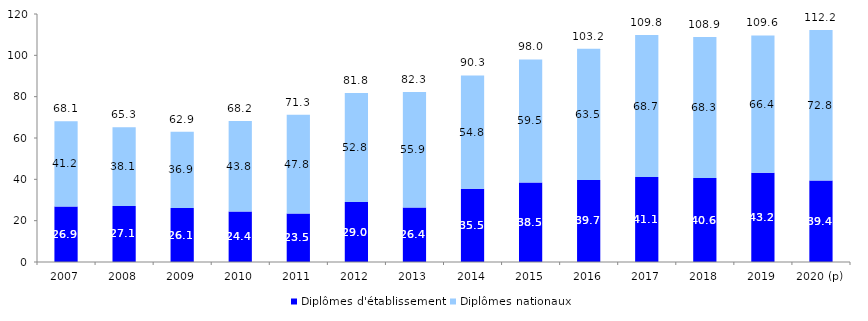
| Category | Diplômes d'établissement | Diplômes nationaux  |
|---|---|---|
| 2007 | 26.9 | 41.2 |
| 2008 | 27.1 | 38.1 |
| 2009 | 26.1 | 36.9 |
| 2010 | 24.4 | 43.8 |
| 2011 | 23.5 | 47.8 |
| 2012 | 29 | 52.8 |
| 2013 | 26.4 | 55.9 |
| 2014 | 35.5 | 54.8 |
| 2015 | 38.5 | 59.5 |
| 2016 | 39.7 | 63.5 |
| 2017 | 41.1 | 68.7 |
| 2018 | 40.6 | 68.3 |
| 2019 | 43.2 | 66.4 |
| 2020 (p) | 39.4 | 72.8 |